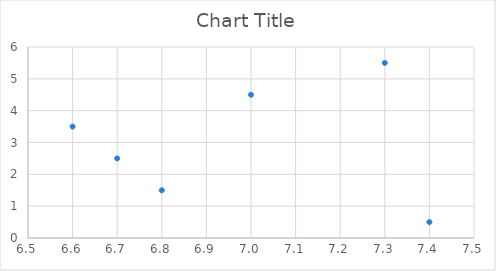
| Category | Series 0 |
|---|---|
| 7.3 | 5.5 |
| 7.0 | 4.5 |
| 6.6 | 3.5 |
| 6.7 | 2.5 |
| 6.8 | 1.5 |
| 7.4 | 0.5 |